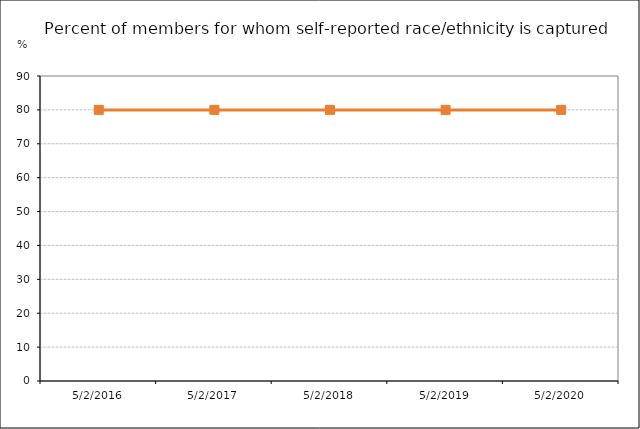
| Category | Values | Date / Observation | Goal |
|---|---|---|---|
| 5/2/16 |  |  | 80 |
| 5/2/17 |  |  | 80 |
| 5/2/18 |  |  | 80 |
| 5/2/19 |  |  | 80 |
| 5/2/20 |  |  | 80 |